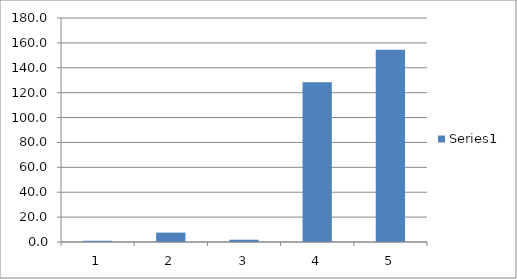
| Category | Series 0 |
|---|---|
| 0 | 1 |
| 1 | 7.551 |
| 2 | 1.829 |
| 3 | 128.311 |
| 4 | 154.429 |